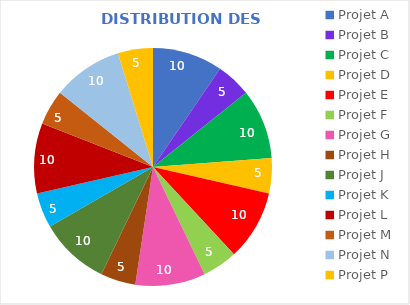
| Category | Series 0 |
|---|---|
| Projet A | 10 |
| Projet B | 5 |
| Projet C | 10 |
| Projet D | 5 |
| Projet E | 10 |
| Projet F | 5 |
| Projet G | 10 |
| Projet H | 5 |
| Projet J | 10 |
| Projet K | 5 |
| Projet L | 10 |
| Projet M | 5 |
| Projet N | 10 |
| Projet P | 5 |